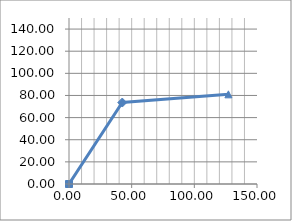
| Category | y |
|---|---|
| 0.0 | 0 |
| 42.50000000000001 | 73.612 |
| 127.17654933779838 | 81.02 |